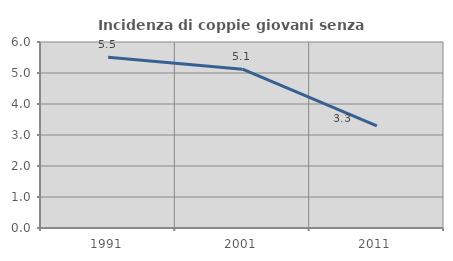
| Category | Incidenza di coppie giovani senza figli |
|---|---|
| 1991.0 | 5.508 |
| 2001.0 | 5.123 |
| 2011.0 | 3.291 |